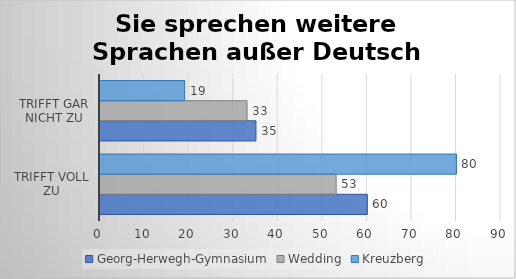
| Category | Georg-Herwegh-Gymnasium | Wedding | Kreuzberg |
|---|---|---|---|
| trifft voll zu | 60 | 53 | 80 |
| trifft gar nicht zu | 35 | 33 | 19 |